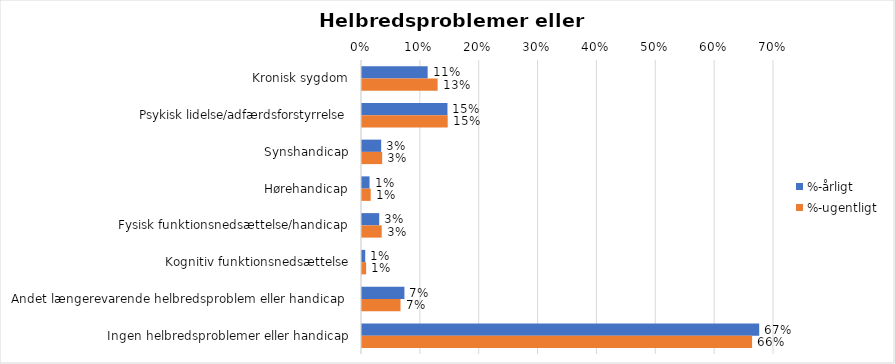
| Category | %-årligt | %-ugentligt |
|---|---|---|
| Kronisk sygdom | 0.112 | 0.129 |
| Psykisk lidelse/adfærdsforstyrrelse | 0.145 | 0.146 |
| Synshandicap | 0.033 | 0.034 |
| Hørehandicap | 0.013 | 0.015 |
| Fysisk funktionsnedsættelse/handicap | 0.029 | 0.033 |
| Kognitiv funktionsnedsættelse | 0.005 | 0.007 |
| Andet længerevarende helbredsproblem eller handicap  | 0.072 | 0.065 |
| Ingen helbredsproblemer eller handicap | 0.675 | 0.663 |